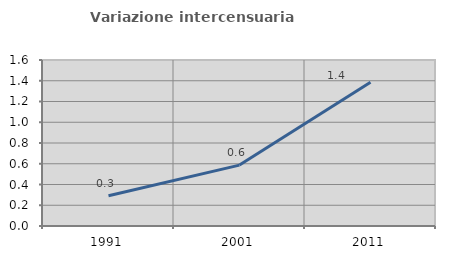
| Category | Variazione intercensuaria annua |
|---|---|
| 1991.0 | 0.292 |
| 2001.0 | 0.587 |
| 2011.0 | 1.385 |